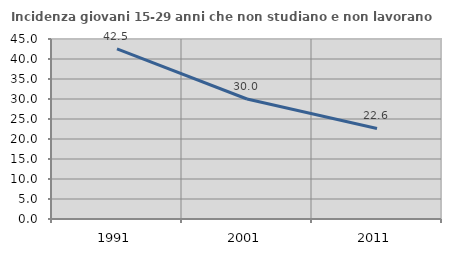
| Category | Incidenza giovani 15-29 anni che non studiano e non lavorano  |
|---|---|
| 1991.0 | 42.541 |
| 2001.0 | 30 |
| 2011.0 | 22.634 |